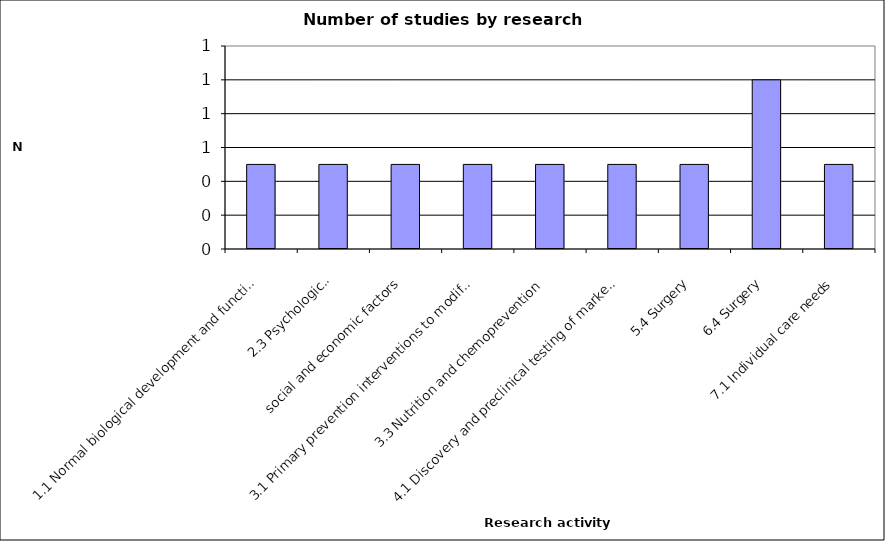
| Category | Total |
|---|---|
| 1.1 Normal biological development and functioning | 0.5 |
| 2.3 Psychological, social and economic factors | 0.5 |
| 3.1 Primary prevention interventions to modify behaviours or promote well-being | 0.5 |
| 3.3 Nutrition and chemoprevention | 0.5 |
| 4.1 Discovery and preclinical testing of markers and technologies | 0.5 |
| 5.4 Surgery | 0.5 |
| 6.4 Surgery | 0.5 |
| 7.1 Individual care needs | 1 |
| 8.4 Research design and methodologies | 0.5 |